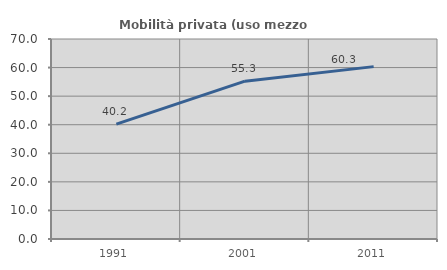
| Category | Mobilità privata (uso mezzo privato) |
|---|---|
| 1991.0 | 40.206 |
| 2001.0 | 55.252 |
| 2011.0 | 60.332 |